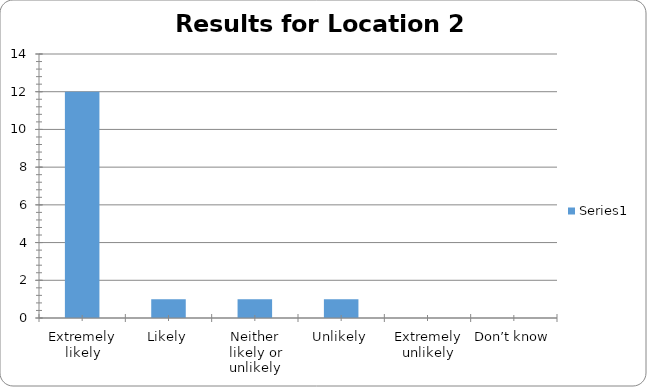
| Category | Series 0 |
|---|---|
| Extremely likely | 12 |
| Likely | 1 |
| Neither likely or unlikely | 1 |
| Unlikely | 1 |
| Extremely unlikely | 0 |
| Don’t know | 0 |